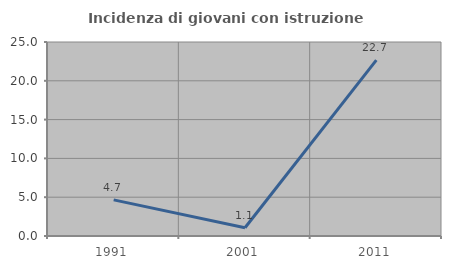
| Category | Incidenza di giovani con istruzione universitaria |
|---|---|
| 1991.0 | 4.651 |
| 2001.0 | 1.064 |
| 2011.0 | 22.667 |